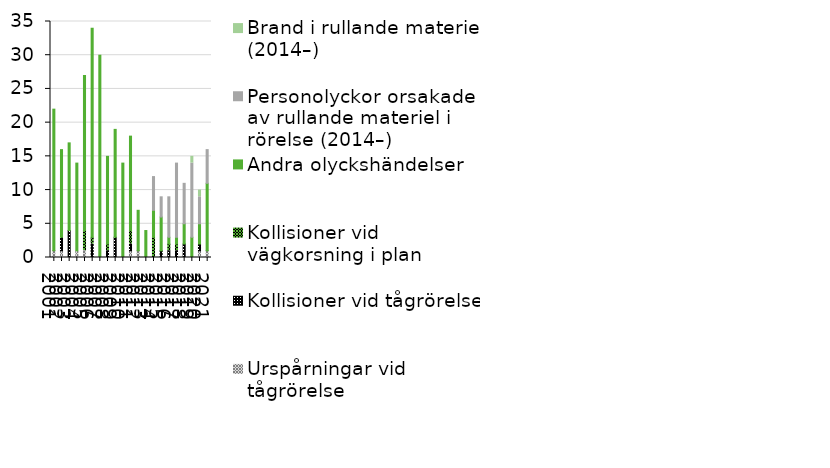
| Category | Urspårningar vid tågrörelse  | Kollisioner vid tågrörelse | Kollisioner vid vägkorsning i plan | Andra olyckshändelser | Personolyckor orsakade av rullande materiel i rörelse (2014–) | Brand i rullande materiel (2014–) |
|---|---|---|---|---|---|---|
| 2001 | 1 | 0 | 0 | 21 | 0 | 0 |
| 2002 | 1 | 2 | 0 | 13 | 0 | 0 |
| 2003 | 0 | 4 | 0 | 13 | 0 | 0 |
| 2004 | 1 | 0 | 0 | 13 | 0 | 0 |
| 2005 | 1 | 0 | 3 | 23 | 0 | 0 |
| 2006 | 0 | 2 | 1 | 31 | 0 | 0 |
| 2007 | 0 | 0 | 0 | 30 | 0 | 0 |
| 2008 | 0 | 1 | 1 | 13 | 0 | 0 |
| 2009 | 0 | 3 | 0 | 16 | 0 | 0 |
| 2010 | 0 | 0 | 0 | 14 | 0 | 0 |
| 2011 | 1 | 1 | 2 | 14 | 0 | 0 |
| 2012 | 1 | 0 | 0 | 6 | 0 | 0 |
| 2013 | 0 | 0 | 0 | 4 | 0 | 0 |
| 2014 | 0 | 0 | 3 | 4 | 5 | 0 |
| 2015 | 0 | 1 | 0 | 5 | 3 | 0 |
| 2016 | 0 | 1 | 1 | 1 | 6 | 0 |
| 2017 | 0 | 1 | 1 | 1 | 11 | 0 |
| 2018 | 0 | 2 | 0 | 3 | 6 | 0 |
| 2019 | 0 | 0 | 0 | 3 | 11 | 1 |
| 2020 | 1 | 1 | 0 | 3 | 4 | 1 |
| 2021 | 1 | 0 | 0 | 10 | 5 | 0 |